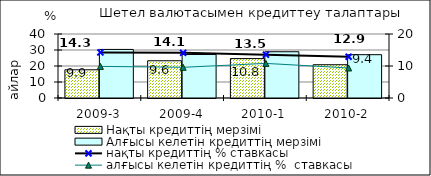
| Category | Нақты кредиттің мерзімі  | Алғысы келетін кредиттің мерзімі  |
|---|---|---|
| 2009-3 | 17.62 | 30.36 |
| 2009-4 | 23.27 | 27.19 |
| 2010-1 | 24.63 | 28.91 |
| 2010-2 | 20.8 | 27.08 |